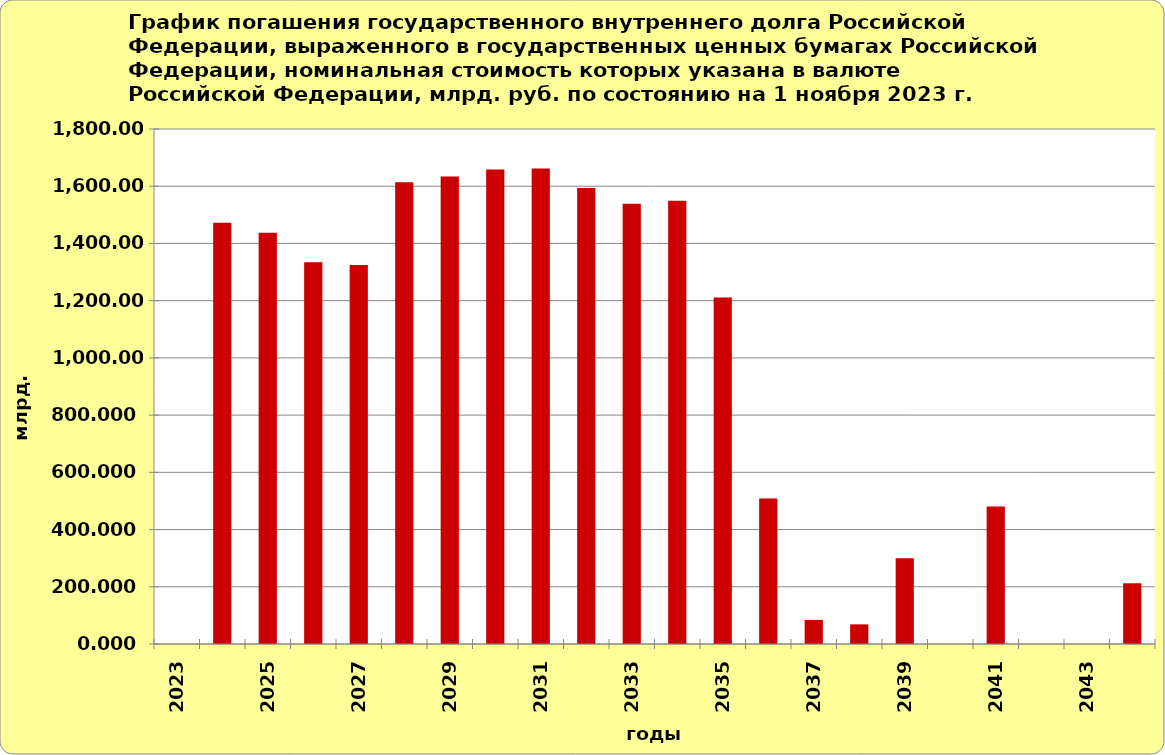
| Category | Series 1 |
|---|---|
| 2023.0 | 0 |
| 2024.0 | 1471.985 |
| 2025.0 | 1437.684 |
| 2026.0 | 1334.561 |
| 2027.0 | 1324.833 |
| 2028.0 | 1613.778 |
| 2029.0 | 1633.774 |
| 2030.0 | 1658.348 |
| 2031.0 | 1661.564 |
| 2032.0 | 1593.459 |
| 2033.0 | 1539.059 |
| 2034.0 | 1548.84 |
| 2035.0 | 1210.91 |
| 2036.0 | 508.553 |
| 2037.0 | 84.139 |
| 2038.0 | 68.639 |
| 2039.0 | 300 |
| 2040.0 | 0 |
| 2041.0 | 480.544 |
| 2042.0 | 0 |
| 2043.0 | 0 |
| 2044.0 | 212.636 |